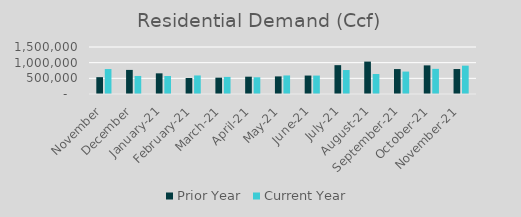
| Category | Prior Year | Current Year |
|---|---|---|
| November | 537591.016 | 796803.85 |
| December | 768795.205 | 575698.992 |
| January-21 | 659359.876 | 574964.407 |
| February-21 | 510296.309 | 591912.627 |
| March-21 | 521598.856 | 545392.69 |
| April-21 | 552550.404 | 533967.423 |
| May-21 | 561680.927 | 591911.753 |
| June-21 | 588815.728 | 587861.265 |
| July-21 | 920418.723 | 764849.567 |
| August-21 | 1034271.241 | 637451.79 |
| September-21 | 795392.365 | 715703.433 |
| October-21 | 913450.318 | 802383.882 |
| November-21 | 796803.85 | 904247.352 |